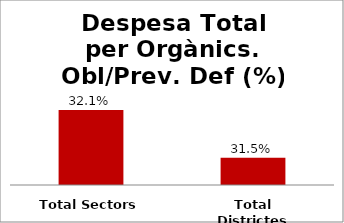
| Category | Series 0 |
|---|---|
| Total Sectors | 0.321 |
| Total Districtes | 0.315 |